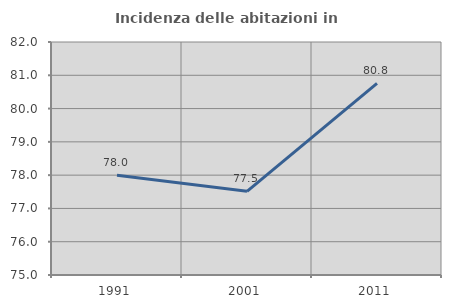
| Category | Incidenza delle abitazioni in proprietà  |
|---|---|
| 1991.0 | 78 |
| 2001.0 | 77.514 |
| 2011.0 | 80.756 |